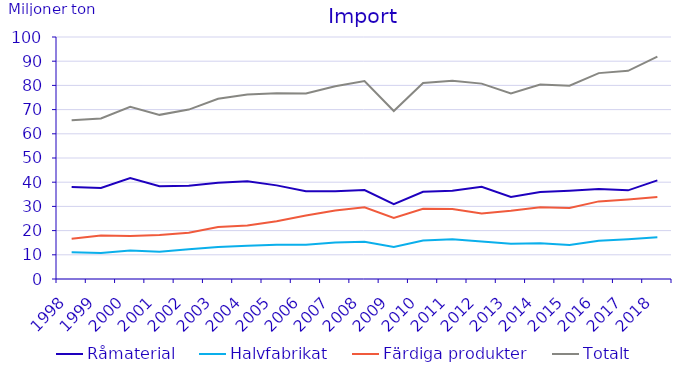
| Category | Råmaterial | Halvfabrikat | Färdiga produkter | Totalt |
|---|---|---|---|---|
| 1998.0 | 37.966 | 11.014 | 16.661 | 65.641 |
| 1999.0 | 37.636 | 10.727 | 17.985 | 66.347 |
| 2000.0 | 41.688 | 11.758 | 17.752 | 71.198 |
| 2001.0 | 38.371 | 11.277 | 18.182 | 67.83 |
| 2002.0 | 38.577 | 12.277 | 19.143 | 69.998 |
| 2003.0 | 39.734 | 13.273 | 21.444 | 74.451 |
| 2004.0 | 40.405 | 13.753 | 22.066 | 76.225 |
| 2005.0 | 38.684 | 14.132 | 23.906 | 76.722 |
| 2006.0 | 36.256 | 14.162 | 26.212 | 76.629 |
| 2007.0 | 36.27 | 15.078 | 28.265 | 79.613 |
| 2008.0 | 36.749 | 15.423 | 29.631 | 81.803 |
| 2009.0 | 30.949 | 13.254 | 25.211 | 69.414 |
| 2010.0 | 36.017 | 15.931 | 29.011 | 80.96 |
| 2011.0 | 36.516 | 16.464 | 28.968 | 81.948 |
| 2012.0 | 38.104 | 15.532 | 27.102 | 80.737 |
| 2013.0 | 33.918 | 14.615 | 28.185 | 76.719 |
| 2014.0 | 35.964 | 14.786 | 29.615 | 80.364 |
| 2015.0 | 36.447 | 14.052 | 29.373 | 79.871 |
| 2016.0 | 37.172 | 15.832 | 32.07 | 85.074 |
| 2017.0 | 36.644 | 16.467 | 32.893 | 86.004 |
| 2018.0 | 40.748 | 17.287 | 33.845 | 91.88 |